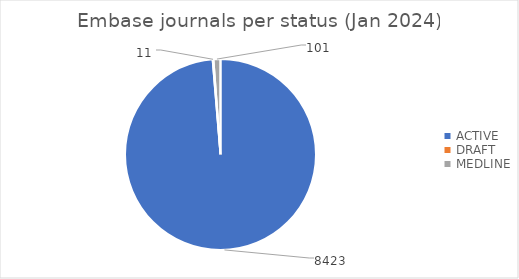
| Category | Embase journals per status (Jan 2024) |
|---|---|
| ACTIVE | 8423 |
| DRAFT | 11 |
| MEDLINE | 101 |